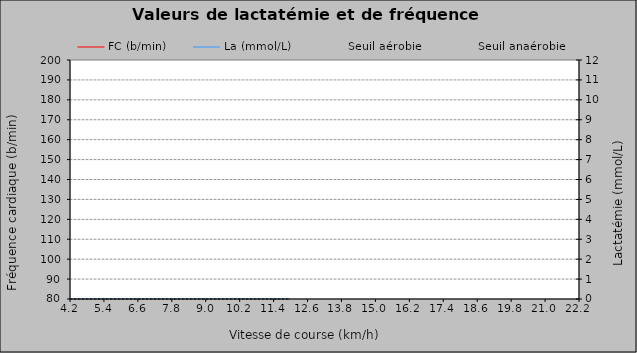
| Category | FC (b/min) |
|---|---|
| 0 | 0 |
| 1 | 0 |
| 2 | 0 |
| 3 | 0 |
| 4 | 0 |
| 5 | 0 |
| 6 | 0 |
| 7 | 0 |
| 8 | 0 |
| 9 | 0 |
| 10 | 0 |
| 11 | 0 |